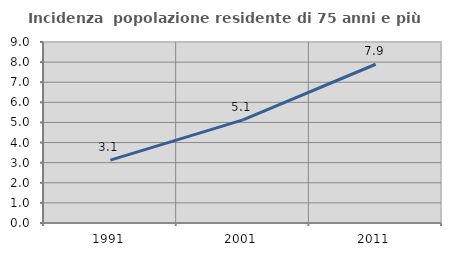
| Category | Incidenza  popolazione residente di 75 anni e più |
|---|---|
| 1991.0 | 3.129 |
| 2001.0 | 5.125 |
| 2011.0 | 7.894 |